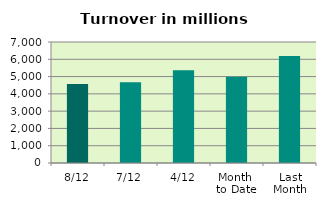
| Category | Series 0 |
|---|---|
| 8/12 | 4564.905 |
| 7/12 | 4668.628 |
| 4/12 | 5360.076 |
| Month 
to Date | 4987.579 |
| Last
Month | 6195.501 |